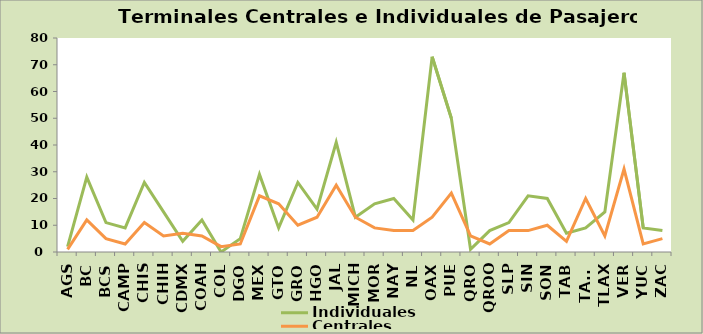
| Category | Individuales | Centrales |
|---|---|---|
| AGS | 2 | 1 |
| BC | 28 | 12 |
| BCS | 11 | 5 |
| CAMP | 9 | 3 |
| CHIS | 26 | 11 |
| CHIH | 15 | 6 |
| CDMX | 4 | 7 |
| COAH | 12 | 6 |
| COL | 0 | 2 |
| DGO | 5 | 3 |
| MEX | 29 | 21 |
| GTO | 9 | 18 |
| GRO | 26 | 10 |
| HGO | 16 | 13 |
| JAL | 41 | 25 |
| MICH | 13 | 13 |
| MOR | 18 | 9 |
| NAY | 20 | 8 |
| NL | 12 | 8 |
| OAX | 73 | 13 |
| PUE | 50 | 22 |
| QRO | 1 | 6 |
| QROO | 8 | 3 |
| SLP | 11 | 8 |
| SIN | 21 | 8 |
| SON | 20 | 10 |
| TAB | 7 | 4 |
| TAMS | 9 | 20 |
| TLAX | 15 | 6 |
| VER | 67 | 31 |
| YUC | 9 | 3 |
| ZAC | 8 | 5 |